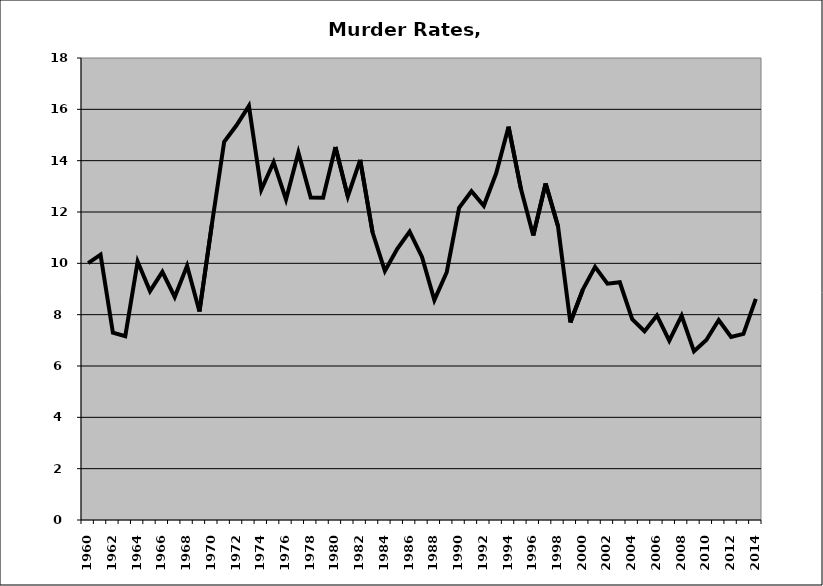
| Category | Murder |
|---|---|
| 1960.0 | 10.009 |
| 1961.0 | 10.339 |
| 1962.0 | 7.295 |
| 1963.0 | 7.162 |
| 1964.0 | 10.069 |
| 1965.0 | 8.919 |
| 1966.0 | 9.669 |
| 1967.0 | 8.688 |
| 1968.0 | 9.906 |
| 1969.0 | 8.125 |
| 1970.0 | 11.502 |
| 1971.0 | 14.735 |
| 1972.0 | 15.378 |
| 1973.0 | 16.133 |
| 1974.0 | 12.866 |
| 1975.0 | 13.939 |
| 1976.0 | 12.489 |
| 1977.0 | 14.316 |
| 1978.0 | 12.562 |
| 1979.0 | 12.552 |
| 1980.0 | 14.533 |
| 1981.0 | 12.609 |
| 1982.0 | 14.034 |
| 1983.0 | 11.21 |
| 1984.0 | 9.7 |
| 1985.0 | 10.563 |
| 1986.0 | 11.238 |
| 1987.0 | 10.248 |
| 1988.0 | 8.565 |
| 1989.0 | 9.653 |
| 1990.0 | 12.164 |
| 1991.0 | 12.809 |
| 1992.0 | 12.242 |
| 1993.0 | 13.507 |
| 1994.0 | 15.324 |
| 1995.0 | 12.903 |
| 1996.0 | 11.082 |
| 1997.0 | 13.109 |
| 1998.0 | 11.446 |
| 1999.0 | 7.693 |
| 2000.0 | 8.964 |
| 2001.0 | 9.861 |
| 2002.0 | 9.209 |
| 2003.0 | 9.262 |
| 2004.0 | 7.826 |
| 2005.0 | 7.358 |
| 2006.0 | 7.971 |
| 2007.0 | 6.989 |
| 2008.0 | 7.959 |
| 2009.0 | 6.572 |
| 2010.0 | 7.01 |
| 2011.0 | 7.792 |
| 2012.0 | 7.132 |
| 2013.0 | 7.252 |
| 2014.0 | 8.617 |